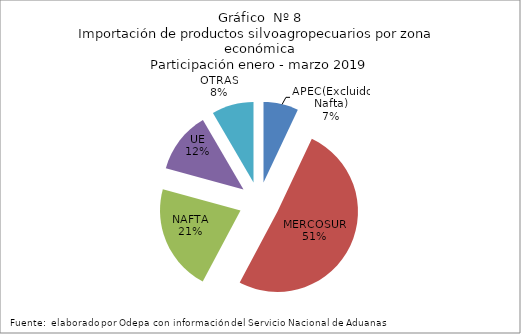
| Category | Series 0 |
|---|---|
| APEC(Excluido Nafta) | 445218.671 |
| MERCOSUR | 3222257.429 |
| NAFTA | 1362488.18 |
| UE | 784414.088 |
| OTRAS | 533795.632 |